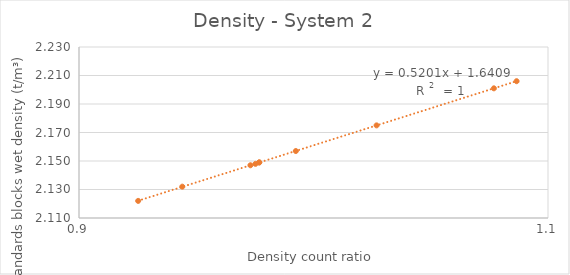
| Category | System 2 |
|---|---|
| 1.0769230769230769 | 2.201 |
| 1.0268961807423347 | 2.175 |
| 0.9731038192576654 | 2.147 |
| 0.9924690693921463 | 2.157 |
| 1.0866057019903175 | 2.206 |
| 0.9768692845615923 | 2.149 |
| 0.9752555137170522 | 2.148 |
| 0.9252286175363098 | 2.122 |
| 0.9440559440559441 | 2.132 |
| 0.9768692845615923 | 2.149 |